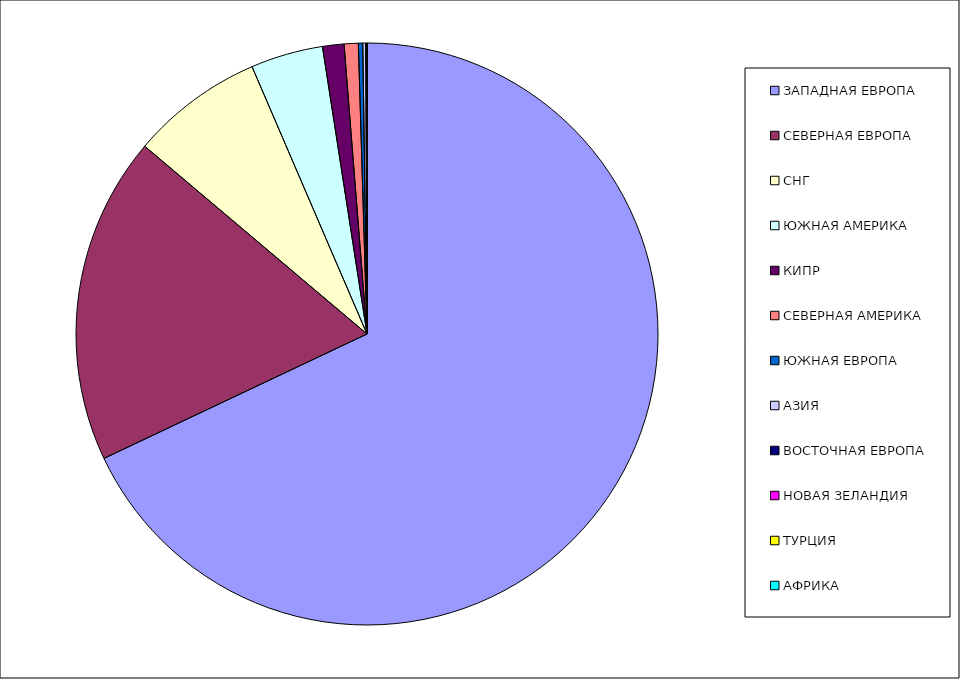
| Category | Оборот |
|---|---|
| ЗАПАДНАЯ ЕВРОПА | 0.68 |
| СЕВЕРНАЯ ЕВРОПА | 0.182 |
| СНГ | 0.074 |
| ЮЖНАЯ АМЕРИКА | 0.04 |
| КИПР | 0.012 |
| СЕВЕРНАЯ АМЕРИКА | 0.008 |
| ЮЖНАЯ ЕВРОПА | 0.002 |
| АЗИЯ | 0.002 |
| ВОСТОЧНАЯ ЕВРОПА | 0.001 |
| НОВАЯ ЗЕЛАНДИЯ | 0 |
| ТУРЦИЯ | 0 |
| АФРИКА | 0 |